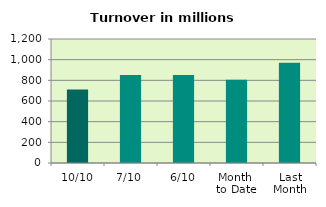
| Category | Series 0 |
|---|---|
| 10/10 | 712.078 |
| 7/10 | 850.773 |
| 6/10 | 852.466 |
| Month 
to Date | 806.599 |
| Last
Month | 970.98 |